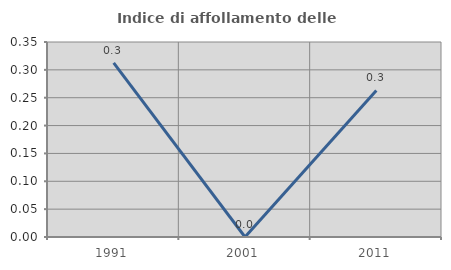
| Category | Indice di affollamento delle abitazioni  |
|---|---|
| 1991.0 | 0.312 |
| 2001.0 | 0 |
| 2011.0 | 0.263 |